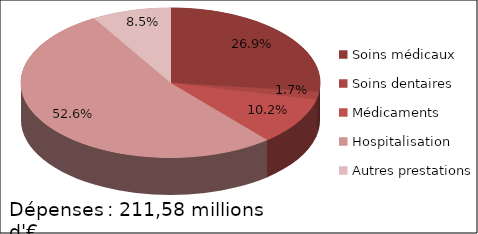
| Category | Series 0 |
|---|---|
| Soins médicaux | 33347398.8 |
| Soins dentaires | 2163380.59 |
| Médicaments | 12715457.85 |
| Hospitalisation | 65307917.56 |
| Autres prestations | 10591389.08 |